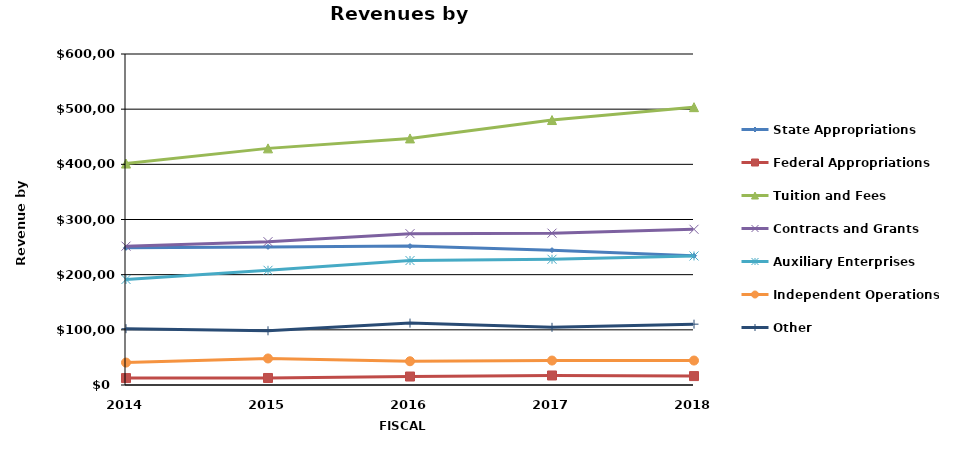
| Category | State Appropriations | Federal Appropriations | Tuition and Fees | Contracts and Grants | Auxiliary Enterprises | Independent Operations | Other |
|---|---|---|---|---|---|---|---|
| 2014.0 | 248633 | 12541 | 401418 | 251681 | 191304 | 40659 | 102103 |
| 2015.0 | 250354 | 12730 | 428932 | 259827 | 207932 | 48100 | 98268 |
| 2016.0 | 251782 | 15367 | 446954 | 274325 | 225621 | 43048 | 112234 |
| 2017.0 | 244458 | 17255 | 480293 | 275261 | 227892 | 44315 | 104559 |
| 2018.0 | 234396 | 16158 | 503619 | 282266 | 233870 | 44335 | 110270 |